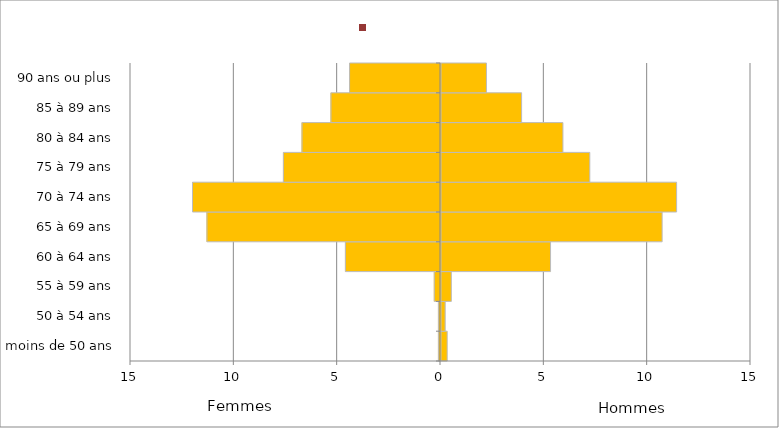
| Category | Series 3 | Series 2 | Series 5 | Droits directs |
|---|---|---|---|---|
|  moins de 50 ans | 0 | 0.1 | 0.3 | -0.1 |
|  50 à 54 ans | 0 | 0.2 | 0.2 | -0.1 |
|  55 à 59 ans | 0 | 0.3 | 0.5 | -0.3 |
|  60 à 64 ans | 0.5 | 0.3 | 5.3 | -4.6 |
|  65 à 69 ans | 1.4 | 0.1 | 10.7 | -11.3 |
|  70 à 74 ans | 2 | 0 | 11.4 | -12 |
|  75 à 79 ans | 1.7 | 0 | 7.2 | -7.6 |
|  80 à 84 ans | 1.9 | 0 | 5.9 | -6.7 |
|  85 à 89 ans | 1.8 | 0 | 3.9 | -5.3 |
|  90 ans ou plus | 1.4 | 0 | 2.2 | -4.4 |